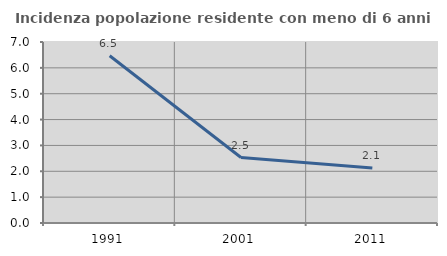
| Category | Incidenza popolazione residente con meno di 6 anni |
|---|---|
| 1991.0 | 6.469 |
| 2001.0 | 2.532 |
| 2011.0 | 2.128 |